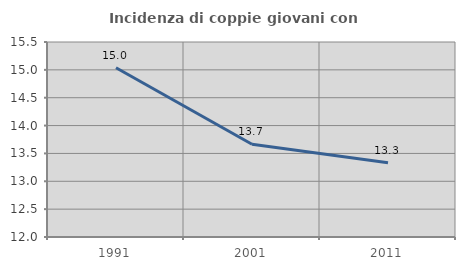
| Category | Incidenza di coppie giovani con figli |
|---|---|
| 1991.0 | 15.038 |
| 2001.0 | 13.665 |
| 2011.0 | 13.333 |